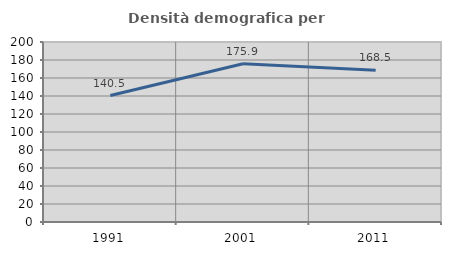
| Category | Densità demografica |
|---|---|
| 1991.0 | 140.508 |
| 2001.0 | 175.888 |
| 2011.0 | 168.475 |